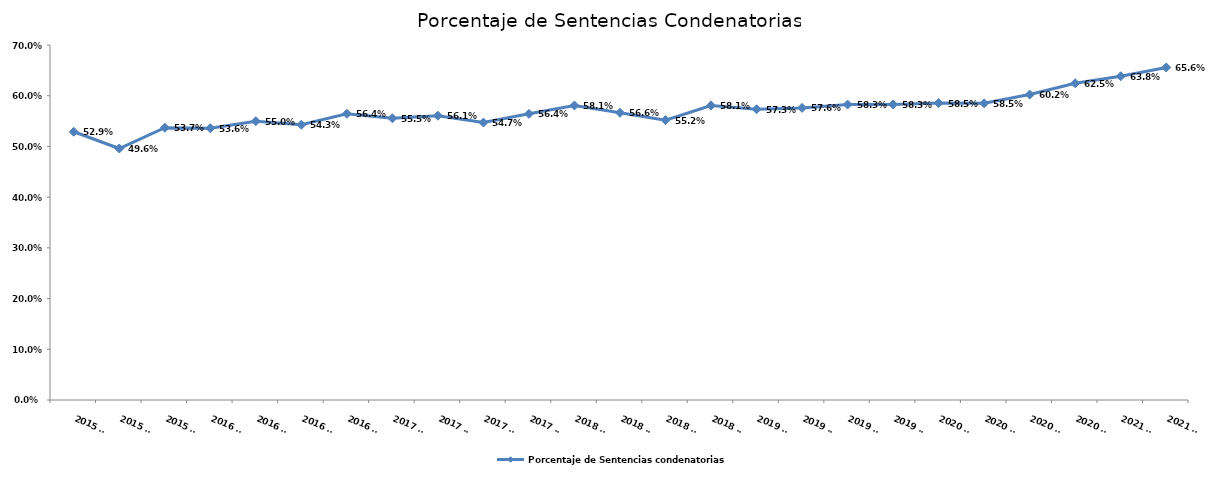
| Category | Porcentaje de Sentencias condenatorias |
|---|---|
| 2015 T2 | 0.529 |
| 2015 T3 | 0.496 |
| 2015 T4 | 0.537 |
| 2016 T1 | 0.536 |
| 2016 T2 | 0.55 |
| 2016 T3 | 0.543 |
| 2016 T4 | 0.564 |
| 2017 T1 | 0.555 |
| 2017 T2 | 0.561 |
| 2017 T3 | 0.547 |
| 2017 T4 | 0.564 |
| 2018 T1 | 0.581 |
| 2018 T2 | 0.566 |
| 2018 T3 | 0.552 |
| 2018 T4 | 0.581 |
| 2019 T1 | 0.573 |
| 2019 T2 | 0.576 |
| 2019 T3 | 0.583 |
| 2019 T4 | 0.583 |
| 2020 T1 | 0.585 |
| 2020 T2 | 0.585 |
| 2020 T3 | 0.602 |
| 2020 T4 | 0.625 |
| 2021 T1 | 0.638 |
| 2021 T2 | 0.656 |